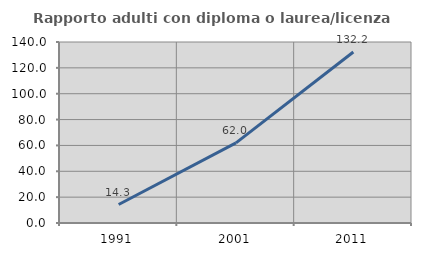
| Category | Rapporto adulti con diploma o laurea/licenza media  |
|---|---|
| 1991.0 | 14.286 |
| 2001.0 | 62.016 |
| 2011.0 | 132.231 |